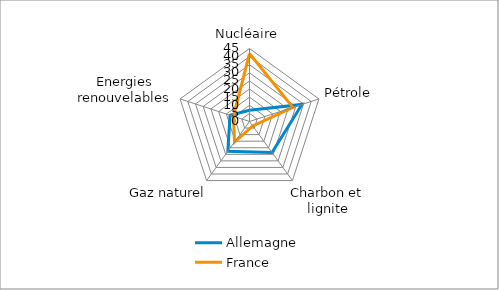
| Category | Allemagne | France |
|---|---|---|
| Nucléaire | 6.9 | 41.9 |
| Pétrole | 34 | 28.1 |
| Charbon et lignite | 23.6 | 3.4 |
| Gaz naturel | 22.7 | 15.7 |
| Energies renouvelables | 12.6 | 10.4 |